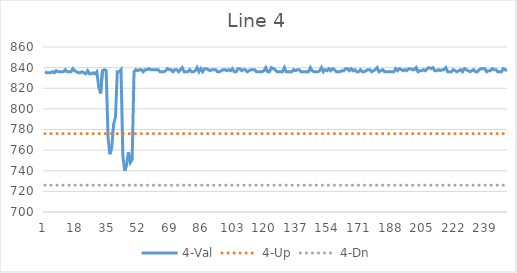
| Category | 4-Val | 4-Up | 4-Dn |
|---|---|---|---|
| 0 | 836 | 776 | 726 |
| 1 | 835 | 776 | 726 |
| 2 | 835 | 776 | 726 |
| 3 | 835 | 776 | 726 |
| 4 | 836 | 776 | 726 |
| 5 | 835 | 776 | 726 |
| 6 | 837 | 776 | 726 |
| 7 | 836 | 776 | 726 |
| 8 | 836 | 776 | 726 |
| 9 | 836 | 776 | 726 |
| 10 | 836 | 776 | 726 |
| 11 | 838 | 776 | 726 |
| 12 | 836 | 776 | 726 |
| 13 | 836 | 776 | 726 |
| 14 | 836 | 776 | 726 |
| 15 | 839 | 776 | 726 |
| 16 | 837 | 776 | 726 |
| 17 | 836 | 776 | 726 |
| 18 | 835 | 776 | 726 |
| 19 | 835 | 776 | 726 |
| 20 | 836 | 776 | 726 |
| 21 | 835 | 776 | 726 |
| 22 | 834 | 776 | 726 |
| 23 | 837 | 776 | 726 |
| 24 | 834 | 776 | 726 |
| 25 | 834 | 776 | 726 |
| 26 | 835 | 776 | 726 |
| 27 | 834 | 776 | 726 |
| 28 | 836 | 776 | 726 |
| 29 | 821 | 776 | 726 |
| 30 | 815 | 776 | 726 |
| 31 | 837 | 776 | 726 |
| 32 | 838 | 776 | 726 |
| 33 | 837 | 776 | 726 |
| 34 | 772 | 776 | 726 |
| 35 | 756 | 776 | 726 |
| 36 | 763 | 776 | 726 |
| 37 | 785 | 776 | 726 |
| 38 | 792 | 776 | 726 |
| 39 | 836 | 776 | 726 |
| 40 | 836 | 776 | 726 |
| 41 | 838 | 776 | 726 |
| 42 | 754 | 776 | 726 |
| 43 | 740 | 776 | 726 |
| 44 | 746 | 776 | 726 |
| 45 | 758 | 776 | 726 |
| 46 | 748 | 776 | 726 |
| 47 | 751 | 776 | 726 |
| 48 | 836 | 776 | 726 |
| 49 | 838 | 776 | 726 |
| 50 | 837 | 776 | 726 |
| 51 | 838 | 776 | 726 |
| 52 | 838 | 776 | 726 |
| 53 | 836 | 776 | 726 |
| 54 | 838 | 776 | 726 |
| 55 | 838 | 776 | 726 |
| 56 | 839 | 776 | 726 |
| 57 | 838 | 776 | 726 |
| 58 | 838 | 776 | 726 |
| 59 | 838 | 776 | 726 |
| 60 | 838 | 776 | 726 |
| 61 | 838 | 776 | 726 |
| 62 | 836 | 776 | 726 |
| 63 | 836 | 776 | 726 |
| 64 | 836 | 776 | 726 |
| 65 | 837 | 776 | 726 |
| 66 | 839 | 776 | 726 |
| 67 | 838 | 776 | 726 |
| 68 | 838 | 776 | 726 |
| 69 | 836 | 776 | 726 |
| 70 | 838 | 776 | 726 |
| 71 | 838 | 776 | 726 |
| 72 | 836 | 776 | 726 |
| 73 | 838 | 776 | 726 |
| 74 | 840 | 776 | 726 |
| 75 | 836 | 776 | 726 |
| 76 | 836 | 776 | 726 |
| 77 | 836 | 776 | 726 |
| 78 | 838 | 776 | 726 |
| 79 | 836 | 776 | 726 |
| 80 | 836 | 776 | 726 |
| 81 | 837 | 776 | 726 |
| 82 | 840 | 776 | 726 |
| 83 | 836 | 776 | 726 |
| 84 | 839 | 776 | 726 |
| 85 | 836 | 776 | 726 |
| 86 | 839 | 776 | 726 |
| 87 | 839 | 776 | 726 |
| 88 | 838 | 776 | 726 |
| 89 | 837 | 776 | 726 |
| 90 | 838 | 776 | 726 |
| 91 | 838 | 776 | 726 |
| 92 | 838 | 776 | 726 |
| 93 | 836 | 776 | 726 |
| 94 | 836 | 776 | 726 |
| 95 | 837 | 776 | 726 |
| 96 | 838 | 776 | 726 |
| 97 | 838 | 776 | 726 |
| 98 | 837 | 776 | 726 |
| 99 | 838 | 776 | 726 |
| 100 | 837 | 776 | 726 |
| 101 | 839 | 776 | 726 |
| 102 | 836 | 776 | 726 |
| 103 | 836 | 776 | 726 |
| 104 | 839 | 776 | 726 |
| 105 | 839 | 776 | 726 |
| 106 | 837 | 776 | 726 |
| 107 | 838 | 776 | 726 |
| 108 | 838 | 776 | 726 |
| 109 | 836 | 776 | 726 |
| 110 | 837 | 776 | 726 |
| 111 | 838 | 776 | 726 |
| 112 | 838 | 776 | 726 |
| 113 | 838 | 776 | 726 |
| 114 | 836 | 776 | 726 |
| 115 | 836 | 776 | 726 |
| 116 | 836 | 776 | 726 |
| 117 | 836 | 776 | 726 |
| 118 | 837 | 776 | 726 |
| 119 | 840 | 776 | 726 |
| 120 | 836 | 776 | 726 |
| 121 | 836 | 776 | 726 |
| 122 | 840 | 776 | 726 |
| 123 | 839 | 776 | 726 |
| 124 | 838 | 776 | 726 |
| 125 | 836 | 776 | 726 |
| 126 | 836 | 776 | 726 |
| 127 | 836 | 776 | 726 |
| 128 | 836 | 776 | 726 |
| 129 | 840 | 776 | 726 |
| 130 | 836 | 776 | 726 |
| 131 | 836 | 776 | 726 |
| 132 | 836 | 776 | 726 |
| 133 | 836 | 776 | 726 |
| 134 | 838 | 776 | 726 |
| 135 | 837 | 776 | 726 |
| 136 | 838 | 776 | 726 |
| 137 | 838 | 776 | 726 |
| 138 | 836 | 776 | 726 |
| 139 | 836 | 776 | 726 |
| 140 | 836 | 776 | 726 |
| 141 | 836 | 776 | 726 |
| 142 | 836 | 776 | 726 |
| 143 | 840 | 776 | 726 |
| 144 | 837 | 776 | 726 |
| 145 | 836 | 776 | 726 |
| 146 | 836 | 776 | 726 |
| 147 | 836 | 776 | 726 |
| 148 | 837 | 776 | 726 |
| 149 | 840 | 776 | 726 |
| 150 | 836 | 776 | 726 |
| 151 | 838 | 776 | 726 |
| 152 | 837 | 776 | 726 |
| 153 | 839 | 776 | 726 |
| 154 | 837 | 776 | 726 |
| 155 | 839 | 776 | 726 |
| 156 | 838 | 776 | 726 |
| 157 | 836 | 776 | 726 |
| 158 | 836 | 776 | 726 |
| 159 | 836 | 776 | 726 |
| 160 | 837 | 776 | 726 |
| 161 | 837 | 776 | 726 |
| 162 | 839 | 776 | 726 |
| 163 | 839 | 776 | 726 |
| 164 | 837 | 776 | 726 |
| 165 | 839 | 776 | 726 |
| 166 | 837 | 776 | 726 |
| 167 | 838 | 776 | 726 |
| 168 | 836 | 776 | 726 |
| 169 | 836 | 776 | 726 |
| 170 | 838 | 776 | 726 |
| 171 | 836 | 776 | 726 |
| 172 | 836 | 776 | 726 |
| 173 | 837 | 776 | 726 |
| 174 | 838 | 776 | 726 |
| 175 | 838 | 776 | 726 |
| 176 | 836 | 776 | 726 |
| 177 | 837 | 776 | 726 |
| 178 | 838 | 776 | 726 |
| 179 | 840 | 776 | 726 |
| 180 | 836 | 776 | 726 |
| 181 | 837 | 776 | 726 |
| 182 | 838 | 776 | 726 |
| 183 | 836 | 776 | 726 |
| 184 | 836 | 776 | 726 |
| 185 | 836 | 776 | 726 |
| 186 | 836 | 776 | 726 |
| 187 | 836 | 776 | 726 |
| 188 | 836 | 776 | 726 |
| 189 | 839 | 776 | 726 |
| 190 | 837 | 776 | 726 |
| 191 | 839 | 776 | 726 |
| 192 | 838 | 776 | 726 |
| 193 | 837 | 776 | 726 |
| 194 | 838 | 776 | 726 |
| 195 | 837 | 776 | 726 |
| 196 | 839 | 776 | 726 |
| 197 | 839 | 776 | 726 |
| 198 | 838 | 776 | 726 |
| 199 | 838 | 776 | 726 |
| 200 | 840 | 776 | 726 |
| 201 | 836 | 776 | 726 |
| 202 | 837 | 776 | 726 |
| 203 | 837 | 776 | 726 |
| 204 | 838 | 776 | 726 |
| 205 | 837 | 776 | 726 |
| 206 | 839 | 776 | 726 |
| 207 | 840 | 776 | 726 |
| 208 | 839 | 776 | 726 |
| 209 | 840 | 776 | 726 |
| 210 | 837 | 776 | 726 |
| 211 | 837 | 776 | 726 |
| 212 | 838 | 776 | 726 |
| 213 | 837 | 776 | 726 |
| 214 | 838 | 776 | 726 |
| 215 | 838 | 776 | 726 |
| 216 | 840 | 776 | 726 |
| 217 | 836 | 776 | 726 |
| 218 | 836 | 776 | 726 |
| 219 | 836 | 776 | 726 |
| 220 | 838 | 776 | 726 |
| 221 | 837 | 776 | 726 |
| 222 | 836 | 776 | 726 |
| 223 | 837 | 776 | 726 |
| 224 | 838 | 776 | 726 |
| 225 | 836 | 776 | 726 |
| 226 | 839 | 776 | 726 |
| 227 | 838 | 776 | 726 |
| 228 | 837 | 776 | 726 |
| 229 | 836 | 776 | 726 |
| 230 | 837 | 776 | 726 |
| 231 | 838 | 776 | 726 |
| 232 | 836 | 776 | 726 |
| 233 | 836 | 776 | 726 |
| 234 | 838 | 776 | 726 |
| 235 | 839 | 776 | 726 |
| 236 | 839 | 776 | 726 |
| 237 | 839 | 776 | 726 |
| 238 | 836 | 776 | 726 |
| 239 | 837 | 776 | 726 |
| 240 | 837 | 776 | 726 |
| 241 | 839 | 776 | 726 |
| 242 | 838 | 776 | 726 |
| 243 | 838 | 776 | 726 |
| 244 | 836 | 776 | 726 |
| 245 | 836 | 776 | 726 |
| 246 | 836 | 776 | 726 |
| 247 | 839 | 776 | 726 |
| 248 | 838 | 776 | 726 |
| 249 | 837 | 776 | 726 |